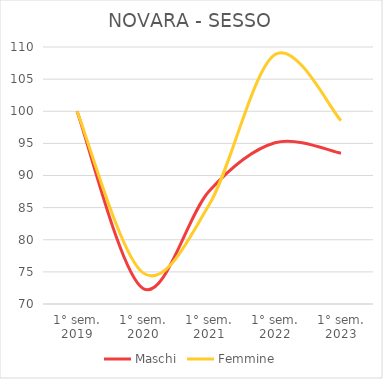
| Category | Maschi | Femmine |
|---|---|---|
| 1° sem.
2019 | 100 | 100 |
| 1° sem.
2020 | 72.424 | 74.844 |
| 1° sem.
2021 | 87.546 | 85.407 |
| 1° sem.
2022 | 95.107 | 108.826 |
| 1° sem.
2023 | 93.477 | 98.541 |